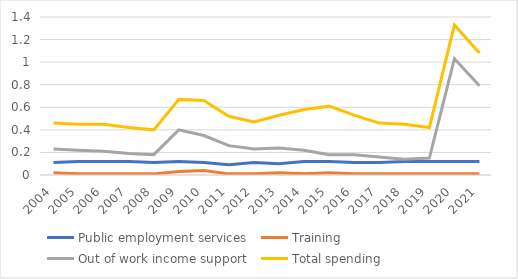
| Category | Public employment services  | Training | Out of work income support | Total spending |
|---|---|---|---|---|
| 2004.0 | 0.11 | 0.02 | 0.23 | 0.46 |
| 2005.0 | 0.12 | 0.01 | 0.22 | 0.45 |
| 2006.0 | 0.12 | 0.01 | 0.21 | 0.45 |
| 2007.0 | 0.12 | 0.01 | 0.19 | 0.42 |
| 2008.0 | 0.11 | 0.01 | 0.18 | 0.4 |
| 2009.0 | 0.12 | 0.03 | 0.4 | 0.67 |
| 2010.0 | 0.11 | 0.04 | 0.35 | 0.66 |
| 2011.0 | 0.09 | 0.01 | 0.26 | 0.52 |
| 2012.0 | 0.11 | 0.01 | 0.23 | 0.47 |
| 2013.0 | 0.1 | 0.02 | 0.24 | 0.53 |
| 2014.0 | 0.12 | 0.01 | 0.22 | 0.58 |
| 2015.0 | 0.12 | 0.02 | 0.18 | 0.61 |
| 2016.0 | 0.11 | 0.01 | 0.18 | 0.53 |
| 2017.0 | 0.11 | 0.01 | 0.16 | 0.46 |
| 2018.0 | 0.12 | 0.01 | 0.14 | 0.45 |
| 2019.0 | 0.12 | 0.01 | 0.15 | 0.42 |
| 2020.0 | 0.12 | 0.01 | 1.03 | 1.33 |
| 2021.0 | 0.12 | 0.01 | 0.79 | 1.08 |